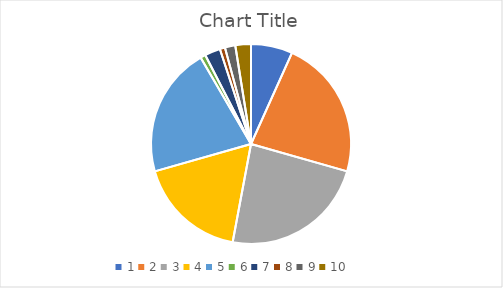
| Category | Series 0 |
|---|---|
| 0 | 8 |
| 1 | 27 |
| 2 | 28 |
| 3 | 21 |
| 4 | 25 |
| 5 | 1 |
| 6 | 3 |
| 7 | 1 |
| 8 | 2 |
| 9 | 3 |